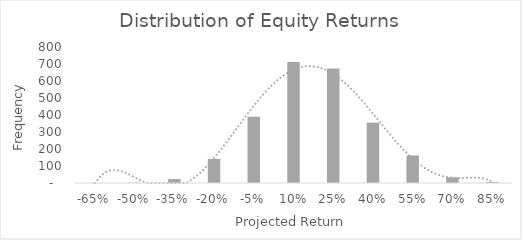
| Category | Frequency |
|---|---|
| -0.65 | 1 |
| -0.5 | 2 |
| -0.35 | 23 |
| -0.19999999999999998 | 142 |
| -0.04999999999999999 | 390 |
| 0.1 | 712 |
| 0.25 | 674 |
| 0.4 | 355 |
| 0.55 | 162 |
| 0.7000000000000001 | 33 |
| 0.8500000000000001 | 6 |